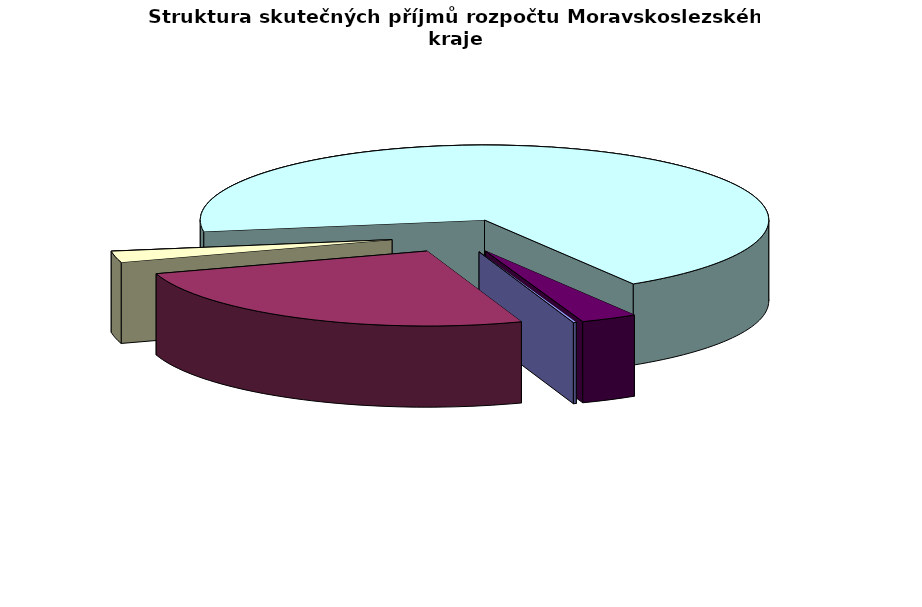
| Category | Čerpání v tis. Kč |
|---|---|
| Kapitálové příjmy | 60739.761 |
| Daňové příjmy | 9093005.871 |
| Investiční dotace | 866213.904 |
| Neinvestiční dotace | 24507530.081 |
| Nedaňové příjmy | 1146215.937 |